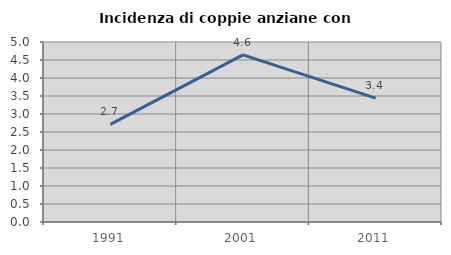
| Category | Incidenza di coppie anziane con figli |
|---|---|
| 1991.0 | 2.711 |
| 2001.0 | 4.643 |
| 2011.0 | 3.439 |